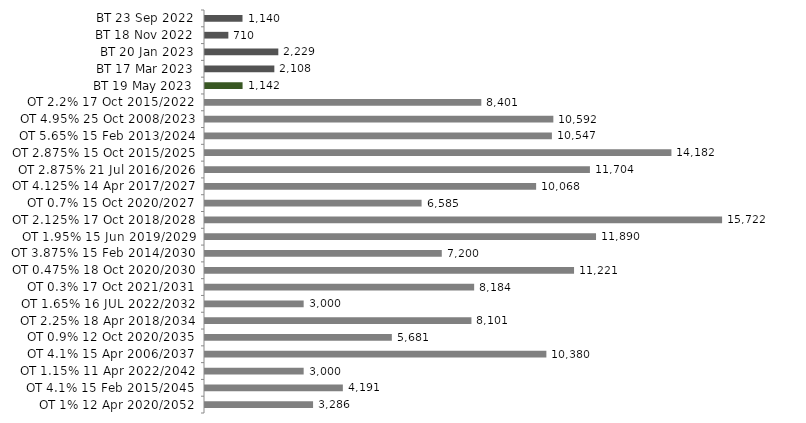
| Category | Series 0 |
|---|---|
| BT 23 Sep 2022 | 1140.323 |
| BT 18 Nov 2022 | 710.044 |
| BT 20 Jan 2023 | 2229.005 |
| BT 17 Mar 2023 | 2108.333 |
| BT 19 May 2023 | 1142.487 |
| OT 2.2% 17 Oct 2015/2022 | 8401.262 |
| OT 4.95% 25 Oct 2008/2023 | 10591.734 |
| OT 5.65% 15 Feb 2013/2024 | 10547.355 |
| OT 2.875% 15 Oct 2015/2025 | 14181.75 |
| OT 2.875% 21 Jul 2016/2026 | 11703.946 |
| OT 4.125% 14 Apr 2017/2027 | 10068.169 |
| OT 0.7% 15 Oct 2020/2027 | 6585.456 |
| OT 2.125% 17 Oct 2018/2028 | 15722.387 |
| OT 1.95% 15 Jun 2019/2029 | 11889.72 |
| OT 3.875% 15 Feb 2014/2030 | 7199.513 |
| OT 0.475% 18 Oct 2020/2030 | 11221.218 |
| OT 0.3% 17 Oct 2021/2031 | 8183.753 |
| OT 1.65% 16 JUL 2022/2032 | 3000 |
| OT 2.25% 18 Apr 2018/2034 | 8100.85 |
| OT 0.9% 12 Oct 2020/2035 | 5681 |
| OT 4.1% 15 Apr 2006/2037 | 10379.698 |
| OT 1.15% 11 Apr 2022/2042 | 3000 |
| OT 4.1% 15 Feb 2015/2045 | 4191.316 |
| OT 1% 12 Apr 2020/2052 | 3286 |